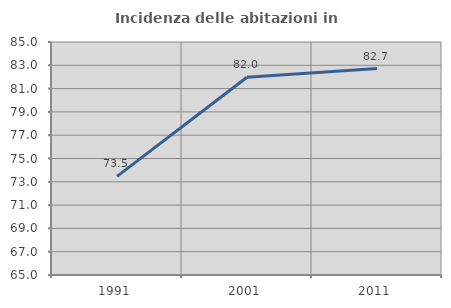
| Category | Incidenza delle abitazioni in proprietà  |
|---|---|
| 1991.0 | 73.468 |
| 2001.0 | 81.976 |
| 2011.0 | 82.721 |